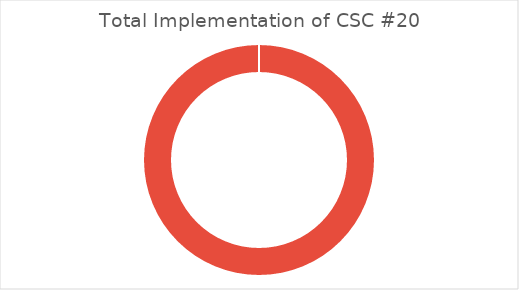
| Category | Series 0 |
|---|---|
| 0 | 0 |
| 1 | 1 |